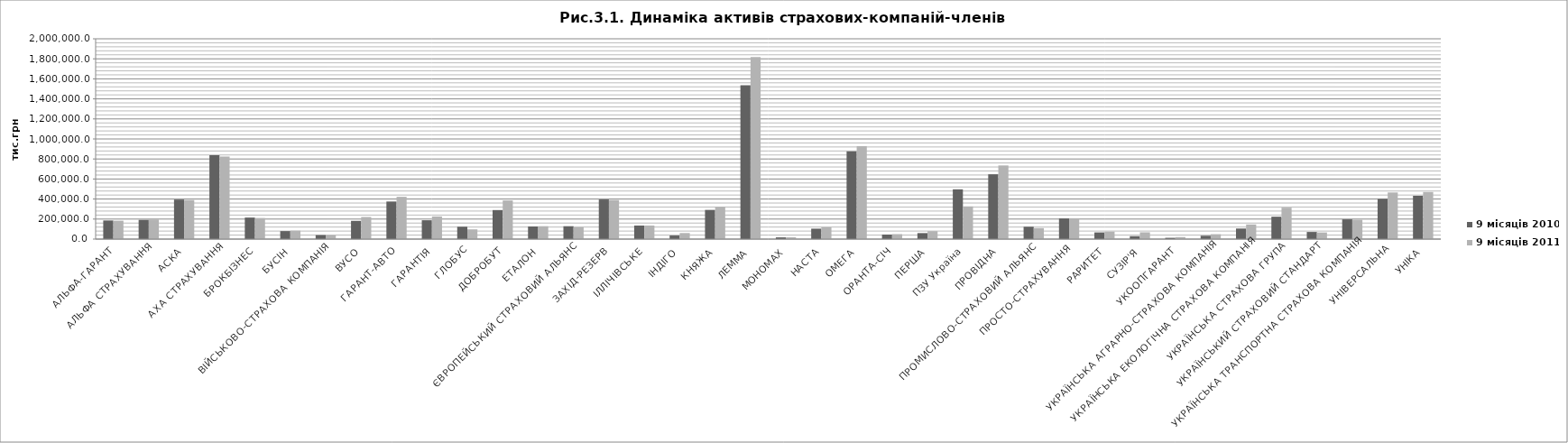
| Category | 9 місяців 2010 | 9 місяців 2011 |
|---|---|---|
| АЛЬФА-ГАРАНТ | 185908.4 | 183633 |
| АЛЬФА СТРАХУВАННЯ | 192066.5 | 195750.9 |
| АСКА | 394782 | 389805 |
| АХА СТРАХУВАННЯ | 837433 | 824201 |
| БРОКБІЗНЕС | 215010.5 | 210229 |
| БУСІН | 79947.4 | 83759.3 |
| ВІЙСЬКОВО-СТРАХОВА КОМПАНІЯ | 39949.9 | 36891.3 |
| ВУСО | 182082.7 | 220621.9 |
| ГАРАНТ-АВТО | 375209 | 422098.6 |
| ГАРАНТІЯ | 188315.4 | 226091 |
| ГЛОБУС | 123593.1 | 97256.2 |
| ДОБРОБУТ | 289765.9 | 385969.1 |
| ЕТАЛОН | 126223 | 128745 |
| ЄВРОПЕЙСЬКИЙ СТРАХОВИЙ АЛЬЯНС | 128647 | 118624.8 |
| ЗАХІД-РЕЗЕРВ | 395678.2 | 389913.6 |
| ІЛЛІЧІВСЬКЕ | 135103 | 135009 |
| ІНДІГО | 35463.4 | 60376.8 |
| КНЯЖА | 291426.6 | 322025.2 |
| ЛЕММА | 1536514 | 1818184 |
| МОНОМАХ | 17213 | 17812.2 |
| НАСТА | 104138.1 | 117926.6 |
| ОМЕГА | 876464.1 | 928430 |
| ОРАНТА-СІЧ | 45413.2 | 49640.5 |
| ПЕРША | 59929 | 79397 |
| ПЗУ Україна | 496700.8 | 326433.6 |
| ПРОВІДНА | 647253.2 | 735419 |
| ПРОМИСЛОВО-СТРАХОВИЙ АЛЬЯНС | 123454 | 109874.4 |
| ПРОСТО-СТРАХУВАННЯ | 206185 | 208391 |
| РАРИТЕТ | 66697 | 74298 |
| СУЗІР'Я | 29341.7 | 67762.3 |
| УКООПГАРАНТ | 12837 | 20187.2 |
| УКРАЇНСЬКА АГРАРНО-СТРАХОВА КОМПАНІЯ | 33393.4 | 48859.4 |
| УКРАЇНСЬКА ЕКОЛОГІЧНА СТРАХОВА КОМПАНІЯ | 105386.5 | 146363.3 |
| УКРАЇНСЬКА СТРАХОВА ГРУПА | 223837.5 | 313985.2 |
| УКРАЇНСЬКИЙ СТРАХОВИЙ СТАНДАРТ | 71240.4 | 66276 |
| УКРАЇНСЬКА ТРАНСПОРТНА СТРАХОВА КОМПАНІЯ | 197299.2 | 192670 |
| УНІВЕРСАЛЬНА | 401041.8 | 465652.9 |
| УНІКА | 432500 | 470233 |